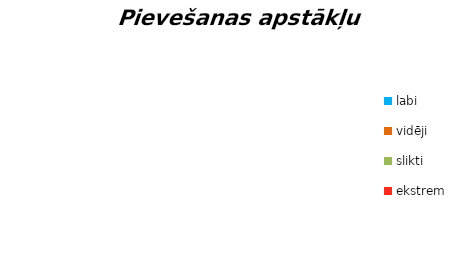
| Category | Series 0 |
|---|---|
| labi | 0 |
| vidēji | 0 |
| slikti | 0 |
| ekstrem | 0 |